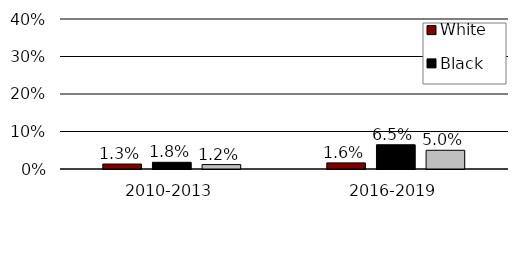
| Category | White | Black | Hispanic |
|---|---|---|---|
| 2010-2013 | 0.013 | 0.018 | 0.012 |
| 2016-2019 | 0.016 | 0.065 | 0.05 |